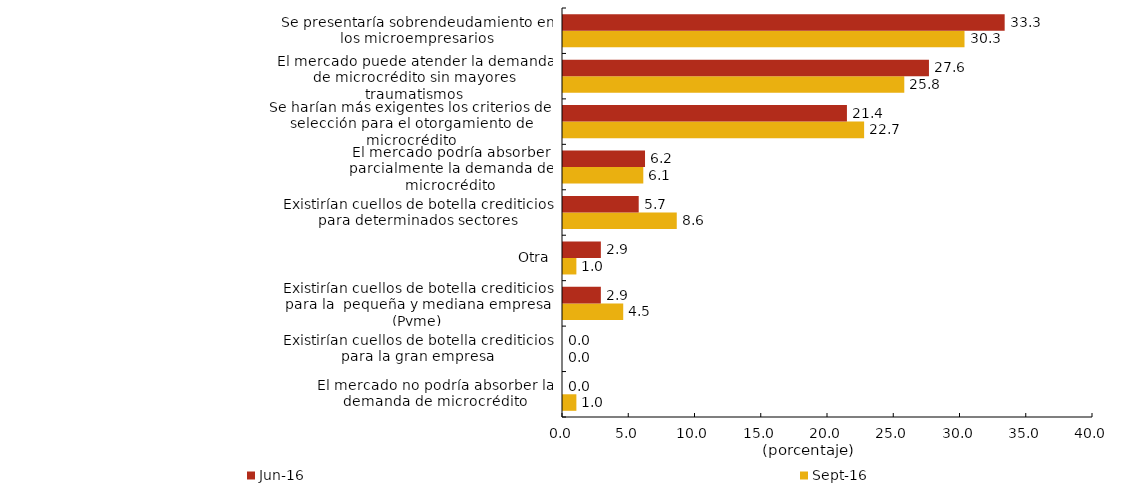
| Category | sep-16 | jun-16 |
|---|---|---|
| El mercado no podría absorber la demanda de microcrédito | 1.01 | 0 |
| Existirían cuellos de botella crediticios para la gran empresa | 0 | 0 |
| Existirían cuellos de botella crediticios para la  pequeña y mediana empresa (Pyme) | 4.545 | 2.857 |
| Otra | 1.01 | 2.857 |
| Existirían cuellos de botella crediticios para determinados sectores | 8.586 | 5.714 |
| El mercado podría absorber parcialmente la demanda de microcrédito | 6.061 | 6.19 |
| Se harían más exigentes los criterios de selección para el otorgamiento de microcrédito | 22.727 | 21.429 |
| El mercado puede atender la demanda de microcrédito sin mayores traumatismos | 25.758 | 27.619 |
| Se presentaría sobrendeudamiento en los microempresarios | 30.303 | 33.333 |